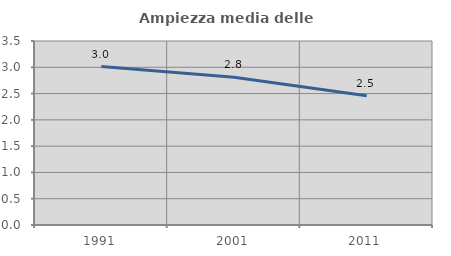
| Category | Ampiezza media delle famiglie |
|---|---|
| 1991.0 | 3.014 |
| 2001.0 | 2.811 |
| 2011.0 | 2.46 |